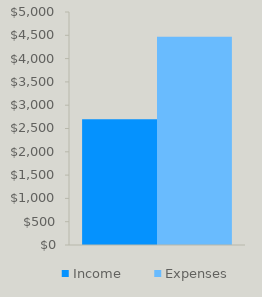
| Category | Income | Expenses |
|---|---|---|
| 0 | 2700 | 4468 |